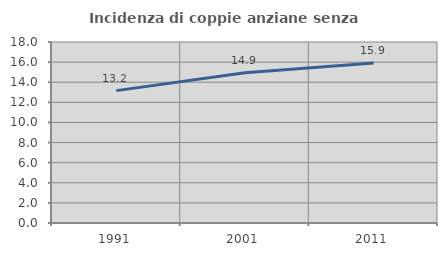
| Category | Incidenza di coppie anziane senza figli  |
|---|---|
| 1991.0 | 13.164 |
| 2001.0 | 14.935 |
| 2011.0 | 15.902 |